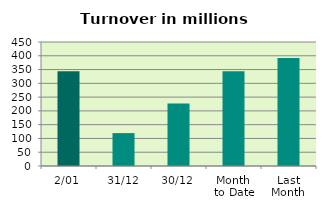
| Category | Series 0 |
|---|---|
| 2/01 | 343.533 |
| 31/12 | 119.341 |
| 30/12 | 226.494 |
| Month 
to Date | 343.533 |
| Last
Month | 391.769 |